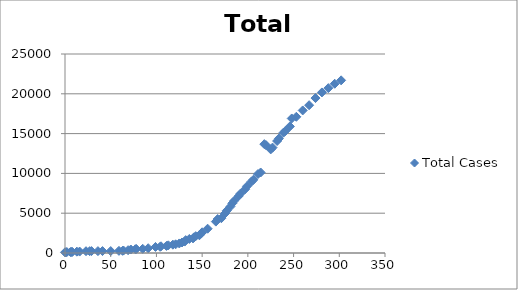
| Category | Total Cases |
|---|---|
| 0.0 | 86 |
| 1.0 | 86 |
| 2.0 | 117 |
| 6.0 | 120 |
| 7.0 | 130 |
| 8.0 | 135 |
| 13.0 | 169 |
| 16.0 | 179 |
| 23.0 | 224 |
| 27.0 | 230 |
| 29.0 | 242 |
| 36.0 | 234 |
| 41.0 | 244 |
| 50.0 | 245 |
| 59.0 | 270 |
| 63.0 | 271 |
| 64.0 | 309 |
| 69.0 | 354 |
| 72.0 | 438 |
| 77.0 | 476 |
| 78.0 | 508 |
| 85.0 | 528 |
| 91.0 | 599 |
| 99.0 | 759 |
| 104.0 | 779 |
| 105.0 | 844 |
| 111.0 | 888 |
| 113.0 | 964 |
| 118.0 | 1048 |
| 121.0 | 1093 |
| 125.0 | 1201 |
| 128.0 | 1322 |
| 131.0 | 1437 |
| 132.0 | 1617 |
| 136.0 | 1766 |
| 140.0 | 1835 |
| 141.0 | 1963 |
| 143.0 | 2115 |
| 147.0 | 2225 |
| 149.0 | 2458 |
| 150.0 | 2599 |
| 156.0 | 3052 |
| 165.0 | 3944 |
| 167.0 | 4269 |
| 171.0 | 4366 |
| 175.0 | 4963 |
| 177.0 | 5325 |
| 181.0 | 5843 |
| 183.0 | 6242 |
| 185.0 | 6553 |
| 190.0 | 7157 |
| 192.0 | 7470 |
| 197.0 | 8011 |
| 199.0 | 8376 |
| 204.0 | 8973 |
| 206.0 | 9191 |
| 211.0 | 9911 |
| 214.0 | 10114 |
| 218.0 | 13676 |
| 220.0 | 13540 |
| 225.0 | 13015 |
| 227.0 | 13241 |
| 232.0 | 14068 |
| 234.0 | 14383 |
| 239.0 | 15113 |
| 241.0 | 15319 |
| 246.0 | 15901 |
| 248.0 | 16899 |
| 253.0 | 17111 |
| 260.0 | 17908 |
| 267.0 | 18569 |
| 274.0 | 19463 |
| 281.0 | 20171 |
| 288.0 | 20712 |
| 295.0 | 21261 |
| 302.0 | 21689 |